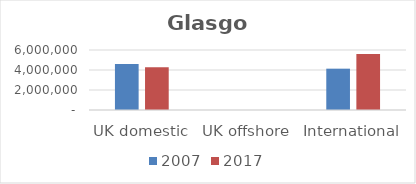
| Category | 2007 | 2017 |
|---|---|---|
| UK domestic | 4598990 | 4279555 |
| UK offshore | 0 | 0 |
| International | 4132641 | 5608462 |